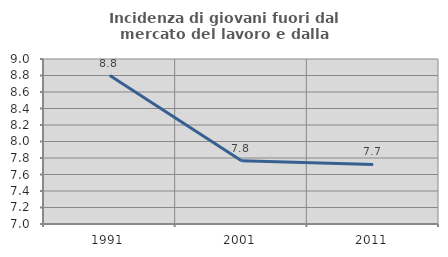
| Category | Incidenza di giovani fuori dal mercato del lavoro e dalla formazione  |
|---|---|
| 1991.0 | 8.8 |
| 2001.0 | 7.767 |
| 2011.0 | 7.722 |